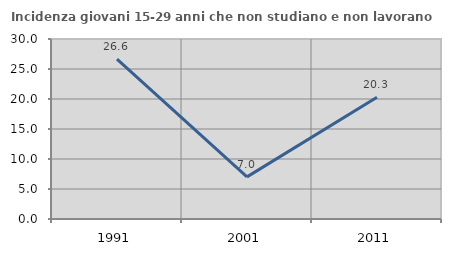
| Category | Incidenza giovani 15-29 anni che non studiano e non lavorano  |
|---|---|
| 1991.0 | 26.627 |
| 2001.0 | 7.018 |
| 2011.0 | 20.29 |